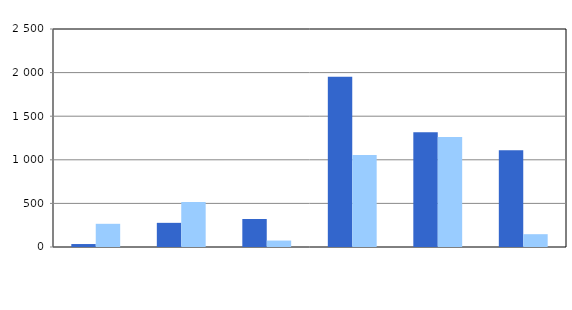
| Category | Series 0 | Series 1 |
|---|---|---|
| 0 | 34 | 266 |
| 1 | 277 | 517 |
| 2 | 321 | 74 |
| 3 | 1952 | 1056 |
| 4 | 1316 | 1261 |
| 5 | 1110 | 147 |